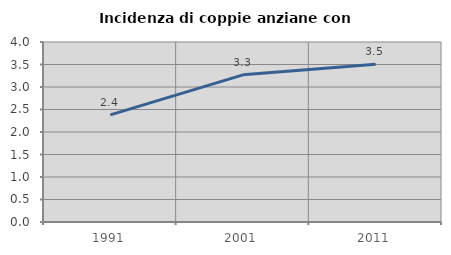
| Category | Incidenza di coppie anziane con figli |
|---|---|
| 1991.0 | 2.38 |
| 2001.0 | 3.27 |
| 2011.0 | 3.507 |